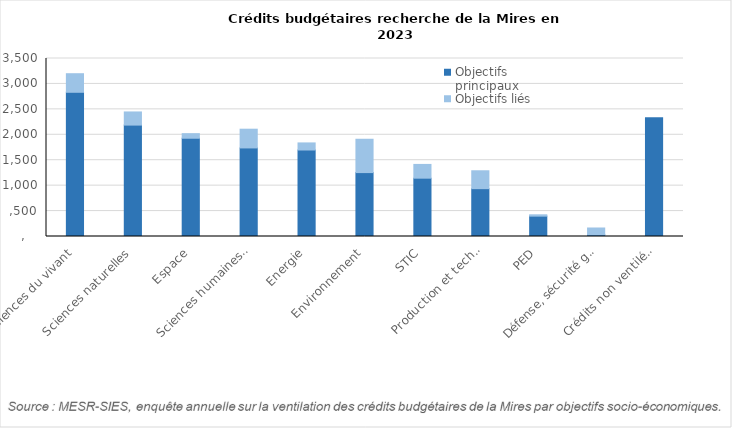
| Category | Objectifs principaux | Objectifs liés |
|---|---|---|
| Sciences du vivant | 2835.6 | 365.3 |
| Sciences naturelles | 2190.5 | 258.5 |
| Espace | 1932.1 | 90.2 |
| Sciences humaines et sociales, vie en société | 1741.5 | 368.3 |
| Energie | 1700.7 | 139.4 |
| Environnement | 1256.7 | 655.4 |
| STIC | 1146.9 | 270.4 |
| Production et technologies industrielles | 940.7 | 351.7 |
| PED | 400.3 | 26.2 |
| Défense, sécurité globale | 34.8 | 132.5 |
| Crédits non ventilés et non répartis | 2333.1 | 0 |